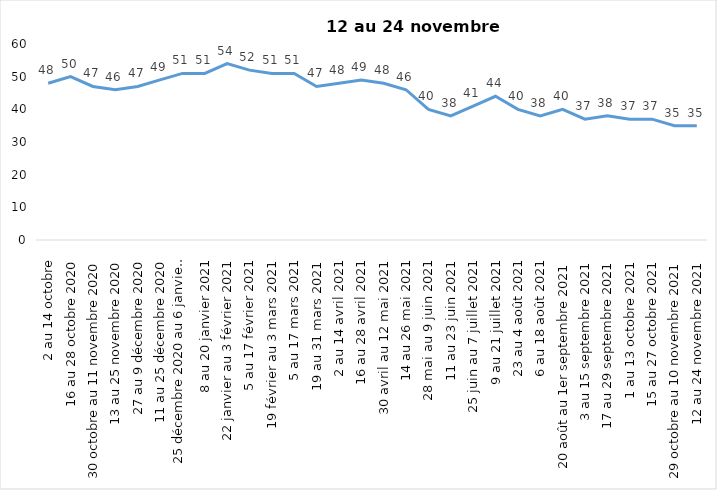
| Category | Toujours aux trois mesures |
|---|---|
| 2 au 14 octobre | 48 |
| 16 au 28 octobre 2020 | 50 |
| 30 octobre au 11 novembre 2020 | 47 |
| 13 au 25 novembre 2020 | 46 |
| 27 au 9 décembre 2020 | 47 |
| 11 au 25 décembre 2020 | 49 |
| 25 décembre 2020 au 6 janvier 2021 | 51 |
| 8 au 20 janvier 2021 | 51 |
| 22 janvier au 3 février 2021 | 54 |
| 5 au 17 février 2021 | 52 |
| 19 février au 3 mars 2021 | 51 |
| 5 au 17 mars 2021 | 51 |
| 19 au 31 mars 2021 | 47 |
| 2 au 14 avril 2021 | 48 |
| 16 au 28 avril 2021 | 49 |
| 30 avril au 12 mai 2021 | 48 |
| 14 au 26 mai 2021 | 46 |
| 28 mai au 9 juin 2021 | 40 |
| 11 au 23 juin 2021 | 38 |
| 25 juin au 7 juillet 2021 | 41 |
| 9 au 21 juillet 2021 | 44 |
| 23 au 4 août 2021 | 40 |
| 6 au 18 août 2021 | 38 |
| 20 août au 1er septembre 2021 | 40 |
| 3 au 15 septembre 2021 | 37 |
| 17 au 29 septembre 2021 | 38 |
| 1 au 13 octobre 2021 | 37 |
| 15 au 27 octobre 2021 | 37 |
| 29 octobre au 10 novembre 2021 | 35 |
| 12 au 24 novembre 2021 | 35 |